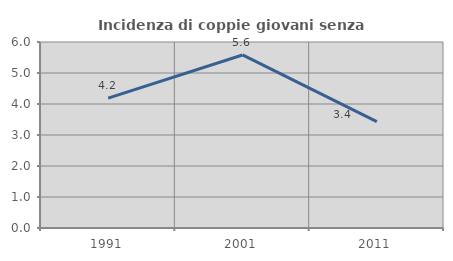
| Category | Incidenza di coppie giovani senza figli |
|---|---|
| 1991.0 | 4.188 |
| 2001.0 | 5.582 |
| 2011.0 | 3.433 |